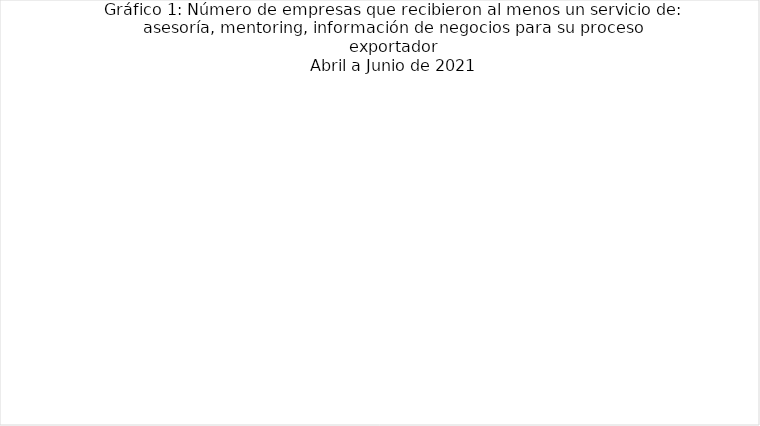
| Category | Número de empresas atendidas con servicios de: Asesoría y mentoring, contactos de negocios, plan de acción para la exportación, evaluación para la exportación  |
|---|---|
| Abril | 42 |
| Mayo | 25 |
| Junio | 41 |